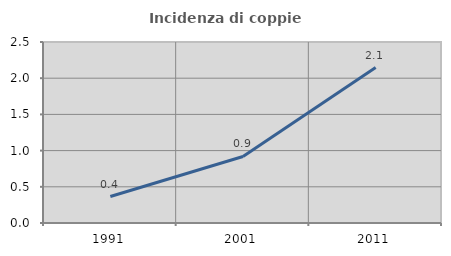
| Category | Incidenza di coppie miste |
|---|---|
| 1991.0 | 0.366 |
| 2001.0 | 0.919 |
| 2011.0 | 2.147 |